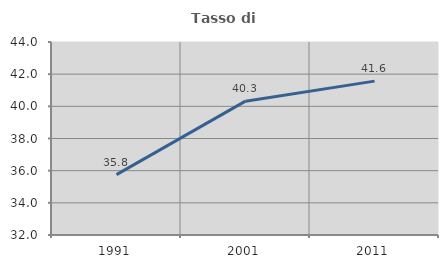
| Category | Tasso di occupazione   |
|---|---|
| 1991.0 | 35.756 |
| 2001.0 | 40.323 |
| 2011.0 | 41.567 |